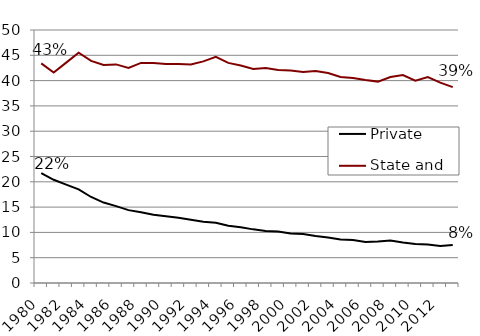
| Category | Private | State and Local |
|---|---|---|
| 1980.0 | 21.7 | 43.4 |
| 1981.0 | 20.4 | 41.6 |
| 1982.0 | 19.45 | 43.55 |
| 1983.0 | 18.5 | 45.5 |
| 1984.0 | 17 | 43.9 |
| 1985.0 | 15.9 | 43.1 |
| 1986.0 | 15.2 | 43.2 |
| 1987.0 | 14.4 | 42.5 |
| 1988.0 | 14 | 43.5 |
| 1989.0 | 13.5 | 43.5 |
| 1990.0 | 13.2 | 43.3 |
| 1991.0 | 12.9 | 43.3 |
| 1992.0 | 12.5 | 43.2 |
| 1993.0 | 12.1 | 43.8 |
| 1994.0 | 11.9 | 44.7 |
| 1995.0 | 11.3 | 43.5 |
| 1996.0 | 11 | 43 |
| 1997.0 | 10.6 | 42.3 |
| 1998.0 | 10.3 | 42.5 |
| 1999.0 | 10.2 | 42.1 |
| 2000.0 | 9.8 | 42 |
| 2001.0 | 9.7 | 41.7 |
| 2002.0 | 9.3 | 41.9 |
| 2003.0 | 9 | 41.5 |
| 2004.0 | 8.6 | 40.7 |
| 2005.0 | 8.5 | 40.5 |
| 2006.0 | 8.1 | 40.1 |
| 2007.0 | 8.2 | 39.8 |
| 2008.0 | 8.4 | 40.7 |
| 2009.0 | 8 | 41.1 |
| 2010.0 | 7.7 | 40 |
| 2011.0 | 7.6 | 40.7 |
| 2012.0 | 7.3 | 39.6 |
| 2013.0 | 7.5 | 38.7 |